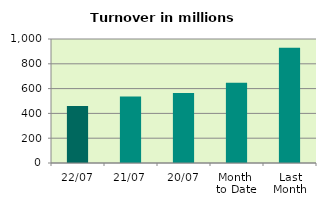
| Category | Series 0 |
|---|---|
| 22/07 | 460.441 |
| 21/07 | 535.82 |
| 20/07 | 565.463 |
| Month 
to Date | 648.049 |
| Last
Month | 929.439 |